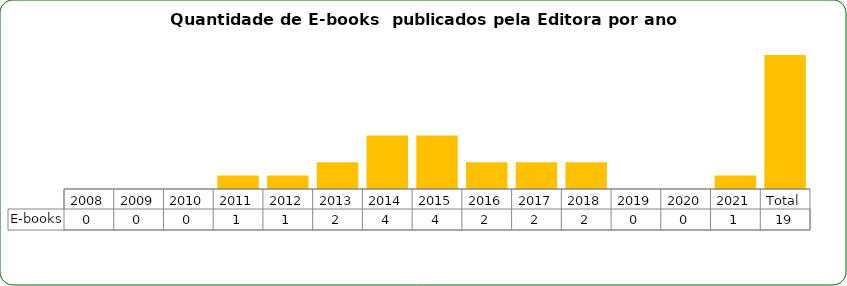
| Category | E-books |
|---|---|
| 2008 | 0 |
| 2009 | 0 |
| 2010 | 0 |
| 2011 | 1 |
| 2012 | 1 |
| 2013 | 2 |
| 2014 | 4 |
| 2015 | 4 |
| 2016 | 2 |
| 2017 | 2 |
| 2018 | 2 |
| 2019 | 0 |
| 2020 | 0 |
| 2021 | 1 |
| Total | 19 |